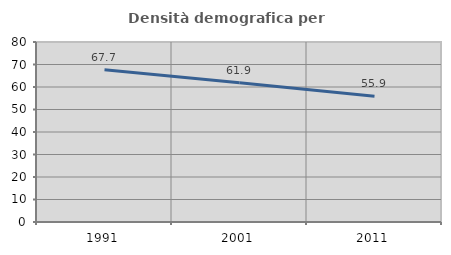
| Category | Densità demografica |
|---|---|
| 1991.0 | 67.677 |
| 2001.0 | 61.852 |
| 2011.0 | 55.854 |